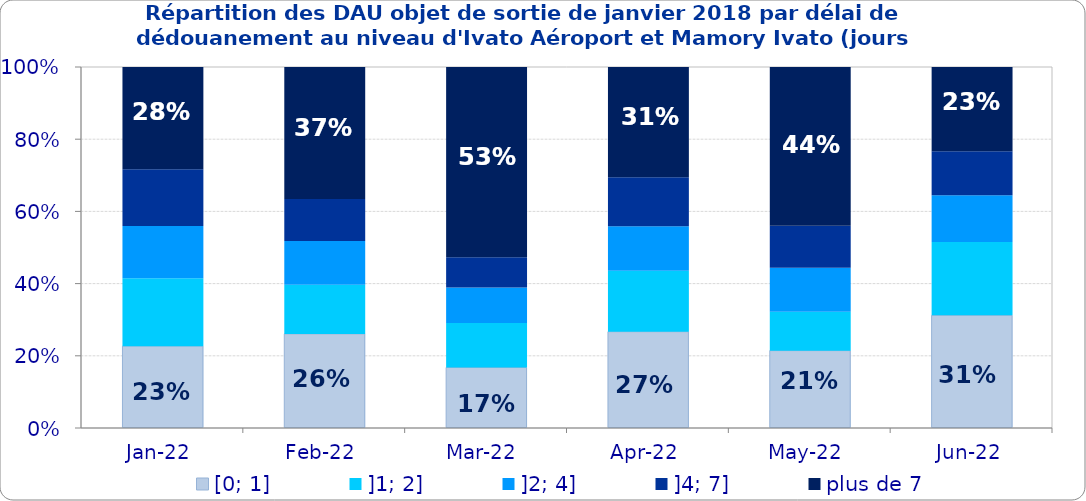
| Category | [0; 1] | ]1; 2] | ]2; 4] | ]4; 7] | plus de 7 |
|---|---|---|---|---|---|
| 2022-01-01 | 0.227 | 0.188 | 0.145 | 0.158 | 0.283 |
| 2022-02-01 | 0.261 | 0.136 | 0.121 | 0.116 | 0.366 |
| 2022-03-01 | 0.168 | 0.123 | 0.098 | 0.083 | 0.527 |
| 2022-04-01 | 0.267 | 0.169 | 0.123 | 0.136 | 0.305 |
| 2022-05-01 | 0.214 | 0.108 | 0.122 | 0.116 | 0.44 |
| 2022-06-01 | 0.312 | 0.203 | 0.129 | 0.122 | 0.233 |